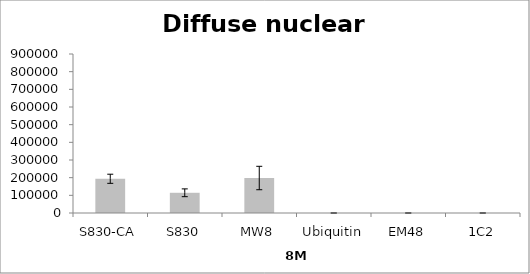
| Category | Series 0 |
|---|---|
| S830-CA | 193762.097 |
| S830 | 114471.959 |
| MW8 | 198014.429 |
| Ubiquitin | 0 |
| EM48 | 0 |
| 1C2 | 0 |